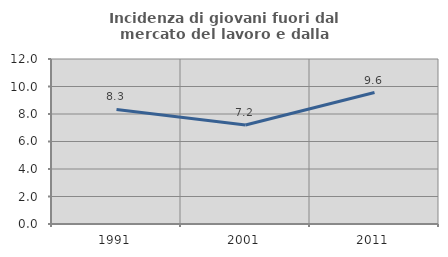
| Category | Incidenza di giovani fuori dal mercato del lavoro e dalla formazione  |
|---|---|
| 1991.0 | 8.333 |
| 2001.0 | 7.2 |
| 2011.0 | 9.559 |